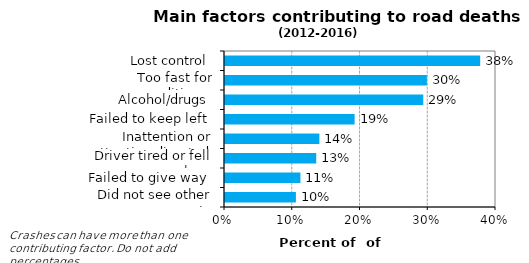
| Category | Series 1 |
|---|---|
| Lost control | 0.377 |
| Too fast for conditions  | 0.298 |
| Alcohol/drugs | 0.293 |
| Failed to keep left | 0.191 |
| Inattention or attention diverted | 0.139 |
| Driver tired or fell asleep | 0.135 |
| Failed to give way | 0.111 |
| Did not see other party | 0.105 |